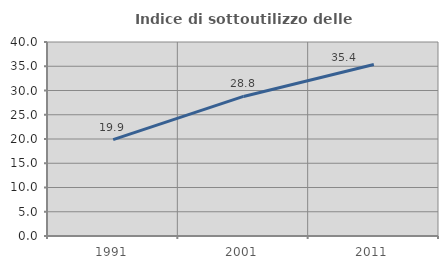
| Category | Indice di sottoutilizzo delle abitazioni  |
|---|---|
| 1991.0 | 19.875 |
| 2001.0 | 28.775 |
| 2011.0 | 35.371 |